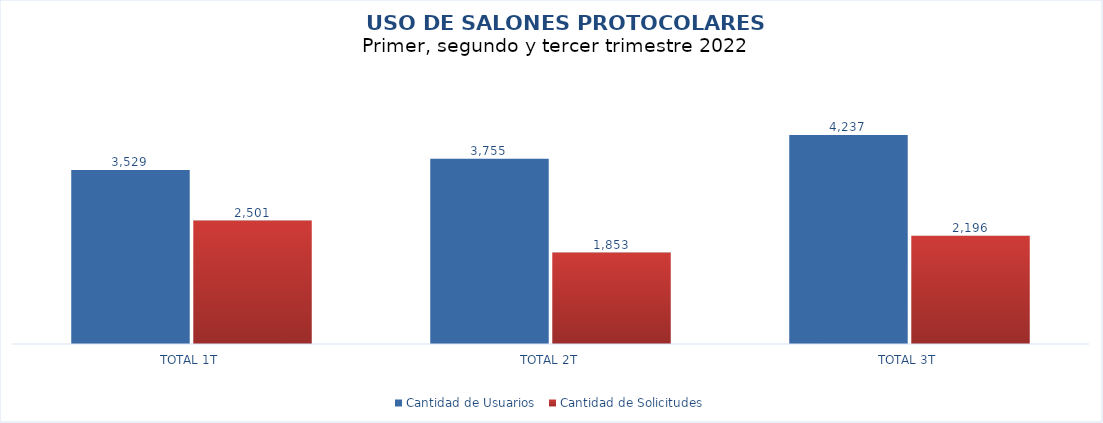
| Category | Cantidad de Usuarios  | Cantidad de Solicitudes |
|---|---|---|
| TOTAL 1T | 3529 | 2501 |
| TOTAL 2T | 3755 | 1853 |
| TOTAL 3T | 4237 | 2196 |